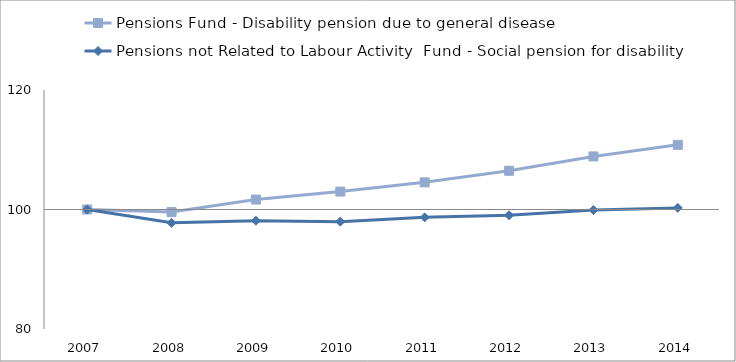
| Category | Pensions Fund - Disability pension due to general disease | Pensions not Related to Labour Activity  Fund - Social pension for disability | 0 |
|---|---|---|---|
| 2007.0 | 100 | 100 |  |
| 2008.0 | 99.57 | 97.768 |  |
| 2009.0 | 101.668 | 98.124 |  |
| 2010.0 | 102.996 | 97.969 |  |
| 2011.0 | 104.543 | 98.683 |  |
| 2012.0 | 106.479 | 99.041 |  |
| 2013.0 | 108.885 | 99.906 |  |
| 2014.0 | 110.826 | 100.268 |  |